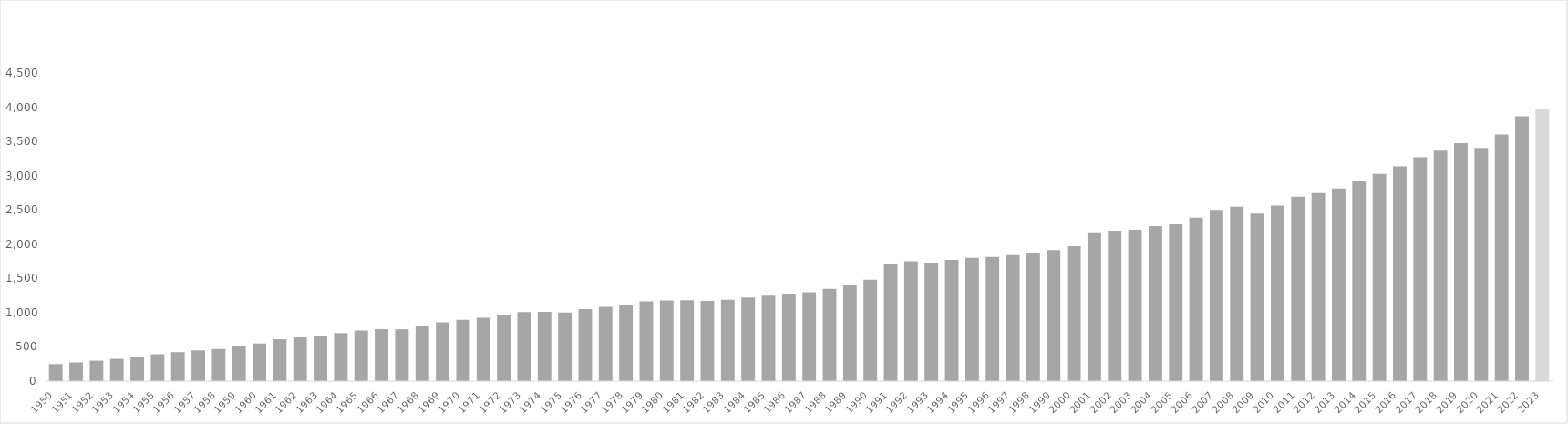
| Category | BIP |
|---|---|
| 1950.0 | 249.2 |
| 1951.0 | 273.3 |
| 1952.0 | 298.8 |
| 1953.0 | 325.5 |
| 1954.0 | 350.7 |
| 1955.0 | 393.2 |
| 1956.0 | 423.6 |
| 1957.0 | 449.2 |
| 1958.0 | 469.2 |
| 1959.0 | 506.1 |
| 1960.0 | 549.7 |
| 1961.0 | 610.9 |
| 1962.0 | 639.4 |
| 1963.0 | 657.4 |
| 1964.0 | 701.2 |
| 1965.0 | 738.7 |
| 1966.0 | 759.3 |
| 1967.0 | 757 |
| 1968.0 | 798.2 |
| 1969.0 | 857.8 |
| 1970.0 | 897 |
| 1971.0 | 926.7 |
| 1972.0 | 964.8 |
| 1973.0 | 1008.8 |
| 1974.0 | 1013.4 |
| 1975.0 | 1002.8 |
| 1976.0 | 1052.9 |
| 1977.0 | 1084.9 |
| 1978.0 | 1117.4 |
| 1979.0 | 1163.9 |
| 1980.0 | 1178.7 |
| 1981.0 | 1180 |
| 1982.0 | 1170.7 |
| 1983.0 | 1188.9 |
| 1984.0 | 1222.5 |
| 1985.0 | 1249.3 |
| 1986.0 | 1279.5 |
| 1987.0 | 1298.3 |
| 1988.0 | 1346.8 |
| 1989.0 | 1399.5 |
| 1990.0 | 1479.6 |
| 1991.0 | 1710.8 |
| 1992.0 | 1749.1 |
| 1993.0 | 1730.1 |
| 1994.0 | 1770.7 |
| 1995.0 | 1801.3 |
| 1996.0 | 1815.1 |
| 1997.0 | 1840.4 |
| 1998.0 | 1876.4 |
| 1999.0 | 1914.8 |
| 2000.0 | 1969.5 |
| 2001.0 | 2172.5 |
| 2002.0 | 2198.1 |
| 2003.0 | 2211.6 |
| 2004.0 | 2262.5 |
| 2005.0 | 2288.3 |
| 2006.0 | 2385.1 |
| 2007.0 | 2499.6 |
| 2008.0 | 2546.5 |
| 2009.0 | 2445.7 |
| 2010.0 | 2564.4 |
| 2011.0 | 2693.6 |
| 2012.0 | 2745.3 |
| 2013.0 | 2811.4 |
| 2014.0 | 2927.4 |
| 2015.0 | 3026.2 |
| 2016.0 | 3134.7 |
| 2017.0 | 3267.2 |
| 2018.0 | 3365.5 |
| 2019.0 | 3473.3 |
| 2020.0 | 3405.4 |
| 2021.0 | 3601.8 |
| 2022.0 | 3867.1 |
| 2023.0 | 3979.242 |